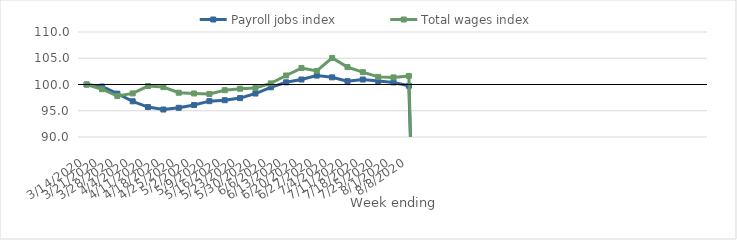
| Category | Payroll jobs index | Total wages index |
|---|---|---|
| 14/03/2020 | 100 | 100 |
| 21/03/2020 | 99.608 | 99.097 |
| 28/03/2020 | 98.258 | 97.799 |
| 04/04/2020 | 96.799 | 98.306 |
| 11/04/2020 | 95.698 | 99.702 |
| 18/04/2020 | 95.233 | 99.505 |
| 25/04/2020 | 95.563 | 98.434 |
| 02/05/2020 | 96.087 | 98.287 |
| 09/05/2020 | 96.83 | 98.199 |
| 16/05/2020 | 97.005 | 98.916 |
| 23/05/2020 | 97.415 | 99.197 |
| 30/05/2020 | 98.279 | 99.353 |
| 06/06/2020 | 99.465 | 100.208 |
| 13/06/2020 | 100.414 | 101.719 |
| 20/06/2020 | 100.947 | 103.133 |
| 27/06/2020 | 101.702 | 102.582 |
| 04/07/2020 | 101.362 | 105.066 |
| 11/07/2020 | 100.632 | 103.313 |
| 18/07/2020 | 100.946 | 102.35 |
| 25/07/2020 | 100.674 | 101.452 |
| 01/08/2020 | 100.397 | 101.354 |
| 08/08/2020 | 99.759 | 101.63 |